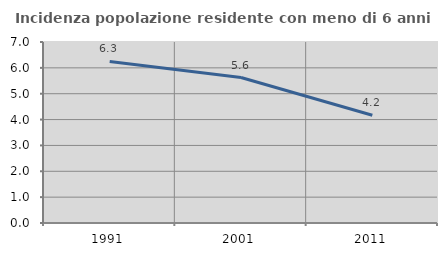
| Category | Incidenza popolazione residente con meno di 6 anni |
|---|---|
| 1991.0 | 6.25 |
| 2001.0 | 5.625 |
| 2011.0 | 4.167 |